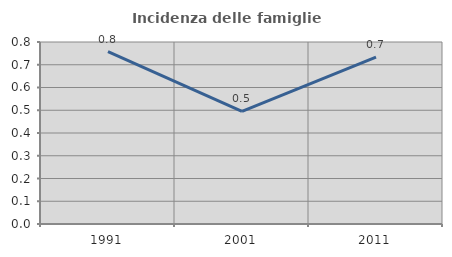
| Category | Incidenza delle famiglie numerose |
|---|---|
| 1991.0 | 0.758 |
| 2001.0 | 0.495 |
| 2011.0 | 0.733 |